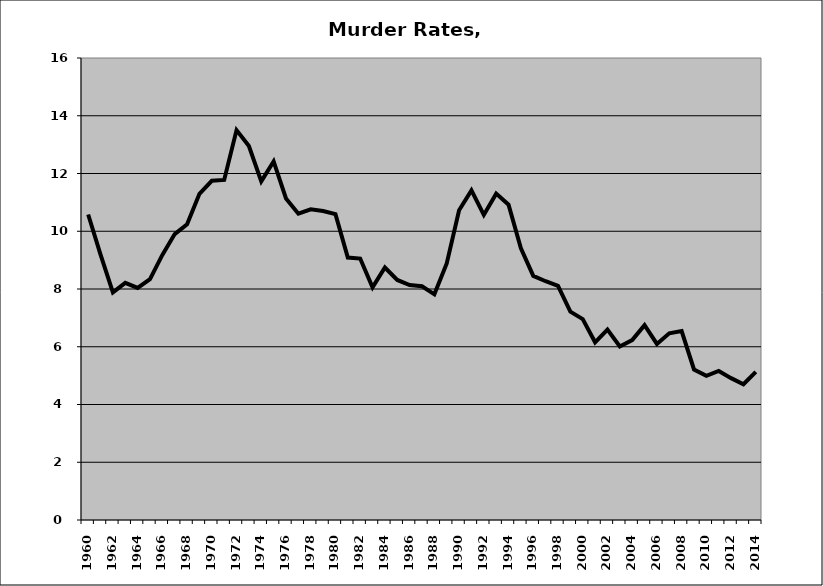
| Category | Murder |
|---|---|
| 1960.0 | 10.579 |
| 1961.0 | 9.189 |
| 1962.0 | 7.884 |
| 1963.0 | 8.214 |
| 1964.0 | 8.038 |
| 1965.0 | 8.344 |
| 1966.0 | 9.18 |
| 1967.0 | 9.903 |
| 1968.0 | 10.243 |
| 1969.0 | 11.297 |
| 1970.0 | 11.747 |
| 1971.0 | 11.776 |
| 1972.0 | 13.502 |
| 1973.0 | 12.953 |
| 1974.0 | 11.729 |
| 1975.0 | 12.42 |
| 1976.0 | 11.135 |
| 1977.0 | 10.606 |
| 1978.0 | 10.758 |
| 1979.0 | 10.703 |
| 1980.0 | 10.593 |
| 1981.0 | 9.091 |
| 1982.0 | 9.055 |
| 1983.0 | 8.057 |
| 1984.0 | 8.743 |
| 1985.0 | 8.313 |
| 1986.0 | 8.135 |
| 1987.0 | 8.093 |
| 1988.0 | 7.815 |
| 1989.0 | 8.888 |
| 1990.0 | 10.726 |
| 1991.0 | 11.415 |
| 1992.0 | 10.566 |
| 1993.0 | 11.303 |
| 1994.0 | 10.919 |
| 1995.0 | 9.409 |
| 1996.0 | 8.453 |
| 1997.0 | 8.269 |
| 1998.0 | 8.11 |
| 1999.0 | 7.215 |
| 2000.0 | 6.957 |
| 2001.0 | 6.154 |
| 2002.0 | 6.598 |
| 2003.0 | 6.009 |
| 2004.0 | 6.229 |
| 2005.0 | 6.745 |
| 2006.0 | 6.097 |
| 2007.0 | 6.467 |
| 2008.0 | 6.543 |
| 2009.0 | 5.213 |
| 2010.0 | 4.992 |
| 2011.0 | 5.16 |
| 2012.0 | 4.914 |
| 2013.0 | 4.701 |
| 2014.0 | 5.129 |